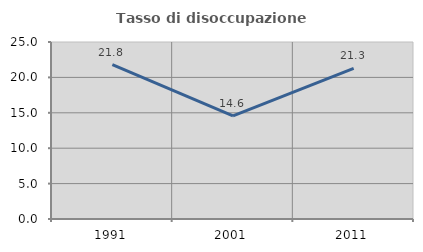
| Category | Tasso di disoccupazione giovanile  |
|---|---|
| 1991.0 | 21.811 |
| 2001.0 | 14.571 |
| 2011.0 | 21.286 |